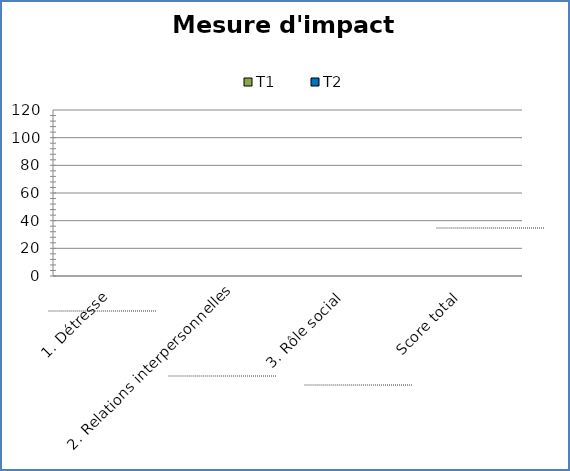
| Category | T1 | T2 |
|---|---|---|
| 1. Détresse | 0 | 0 |
| 2. Relations interpersonnelles | 0 | 0 |
| 3. Rôle social | 0 | 0 |
| Score total | 0 | 0 |